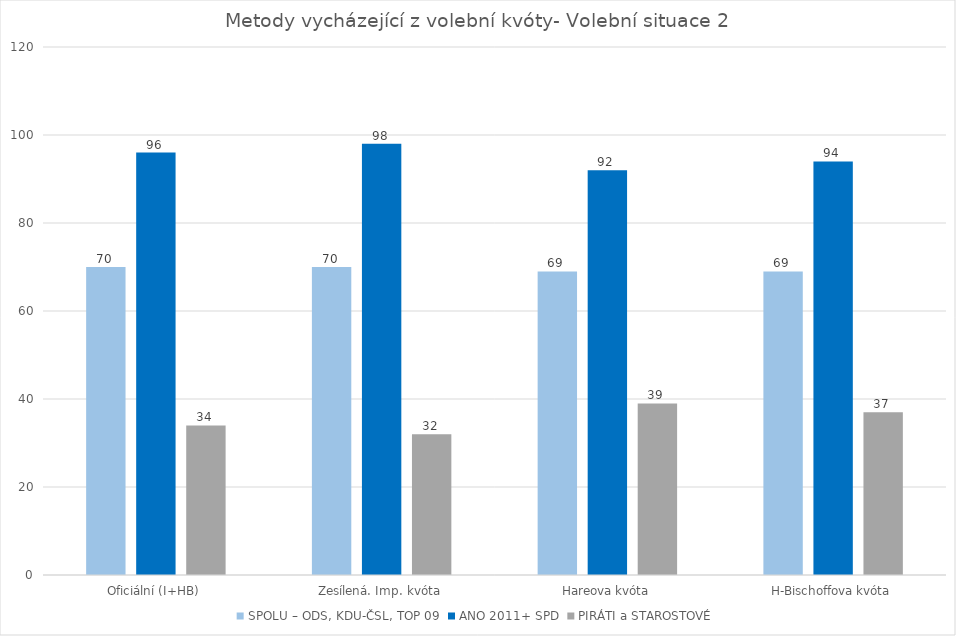
| Category | SPOLU – ODS, KDU-ČSL, TOP 09 | ANO 2011+ SPD | PIRÁTI a STAROSTOVÉ |
|---|---|---|---|
| Oficiální (I+HB) | 70 | 96 | 34 |
| Zesílená. Imp. kvóta | 70 | 98 | 32 |
| Hareova kvóta | 69 | 92 | 39 |
| H-Bischoffova kvóta | 69 | 94 | 37 |